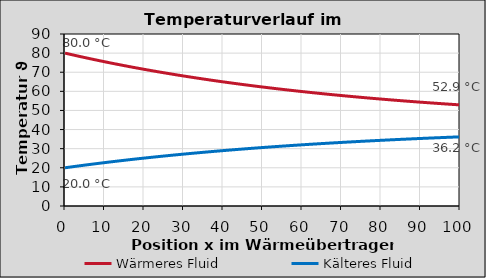
| Category | Wärmeres Fluid | Kälteres Fluid |
|---|---|---|
| 0.0 | 80 | 20 |
| 1.0 | 79.523 | 20.285 |
| 2.0 | 79.052 | 20.566 |
| 3.0 | 78.587 | 20.844 |
| 4.0 | 78.128 | 21.118 |
| 5.0 | 77.675 | 21.389 |
| 6.0 | 77.228 | 21.656 |
| 7.0 | 76.786 | 21.92 |
| 8.0 | 76.35 | 22.181 |
| 9.0 | 75.919 | 22.438 |
| 10.0 | 75.494 | 22.692 |
| 11.0 | 75.074 | 22.942 |
| 12.0 | 74.66 | 23.19 |
| 13.0 | 74.251 | 23.434 |
| 14.0 | 73.847 | 23.676 |
| 15.0 | 73.448 | 23.914 |
| 16.0 | 73.054 | 24.149 |
| 17.0 | 72.666 | 24.381 |
| 18.0 | 72.282 | 24.611 |
| 19.0 | 71.903 | 24.837 |
| 20.0 | 71.529 | 25.061 |
| 21.0 | 71.159 | 25.281 |
| 22.0 | 70.795 | 25.499 |
| 23.0 | 70.434 | 25.714 |
| 24.0 | 70.079 | 25.927 |
| 25.0 | 69.728 | 26.136 |
| 26.0 | 69.382 | 26.343 |
| 27.0 | 69.039 | 26.548 |
| 28.0 | 68.702 | 26.749 |
| 29.0 | 68.368 | 26.949 |
| 30.0 | 68.039 | 27.145 |
| 31.0 | 67.714 | 27.339 |
| 32.0 | 67.393 | 27.531 |
| 33.0 | 67.076 | 27.72 |
| 34.0 | 66.763 | 27.907 |
| 35.0 | 66.454 | 28.092 |
| 36.0 | 66.149 | 28.274 |
| 37.0 | 65.848 | 28.454 |
| 38.0 | 65.551 | 28.631 |
| 39.0 | 65.258 | 28.807 |
| 40.0 | 64.968 | 28.98 |
| 41.0 | 64.682 | 29.151 |
| 42.0 | 64.399 | 29.319 |
| 43.0 | 64.12 | 29.486 |
| 44.0 | 63.845 | 29.65 |
| 45.0 | 63.573 | 29.813 |
| 46.0 | 63.305 | 29.973 |
| 47.0 | 63.04 | 30.131 |
| 48.0 | 62.778 | 30.288 |
| 49.0 | 62.52 | 30.442 |
| 50.0 | 62.265 | 30.594 |
| 51.0 | 62.013 | 30.745 |
| 52.0 | 61.765 | 30.893 |
| 53.0 | 61.519 | 31.04 |
| 54.0 | 61.277 | 31.185 |
| 55.0 | 61.038 | 31.327 |
| 56.0 | 60.802 | 31.468 |
| 57.0 | 60.569 | 31.608 |
| 58.0 | 60.338 | 31.745 |
| 59.0 | 60.111 | 31.881 |
| 60.0 | 59.887 | 32.015 |
| 61.0 | 59.665 | 32.147 |
| 62.0 | 59.446 | 32.278 |
| 63.0 | 59.23 | 32.407 |
| 64.0 | 59.017 | 32.535 |
| 65.0 | 58.807 | 32.66 |
| 66.0 | 58.599 | 32.784 |
| 67.0 | 58.394 | 32.907 |
| 68.0 | 58.191 | 33.028 |
| 69.0 | 57.991 | 33.148 |
| 70.0 | 57.794 | 33.266 |
| 71.0 | 57.599 | 33.382 |
| 72.0 | 57.406 | 33.497 |
| 73.0 | 57.216 | 33.611 |
| 74.0 | 57.028 | 33.723 |
| 75.0 | 56.843 | 33.833 |
| 76.0 | 56.66 | 33.943 |
| 77.0 | 56.48 | 34.05 |
| 78.0 | 56.301 | 34.157 |
| 79.0 | 56.125 | 34.262 |
| 80.0 | 55.951 | 34.366 |
| 81.0 | 55.78 | 34.468 |
| 82.0 | 55.611 | 34.57 |
| 83.0 | 55.443 | 34.67 |
| 84.0 | 55.278 | 34.768 |
| 85.0 | 55.115 | 34.866 |
| 86.0 | 54.954 | 34.962 |
| 87.0 | 54.795 | 35.057 |
| 88.0 | 54.638 | 35.15 |
| 89.0 | 54.483 | 35.243 |
| 90.0 | 54.33 | 35.334 |
| 91.0 | 54.179 | 35.424 |
| 92.0 | 54.03 | 35.514 |
| 93.0 | 53.883 | 35.601 |
| 94.0 | 53.738 | 35.688 |
| 95.0 | 53.594 | 35.774 |
| 96.0 | 53.453 | 35.859 |
| 97.0 | 53.313 | 35.942 |
| 98.0 | 53.175 | 36.025 |
| 99.0 | 53.038 | 36.106 |
| 100.0 | 52.904 | 36.186 |